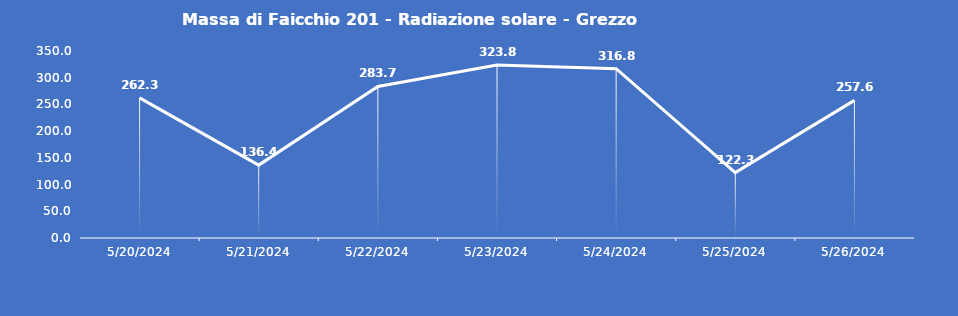
| Category | Massa di Faicchio 201 - Radiazione solare - Grezzo (W/m2) |
|---|---|
| 5/20/24 | 262.3 |
| 5/21/24 | 136.4 |
| 5/22/24 | 283.7 |
| 5/23/24 | 323.8 |
| 5/24/24 | 316.8 |
| 5/25/24 | 122.3 |
| 5/26/24 | 257.6 |